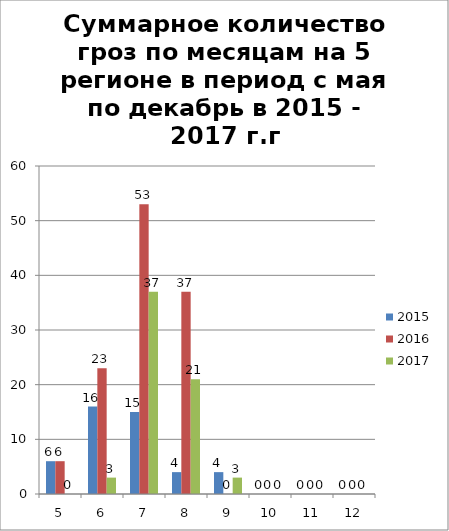
| Category | 2015 | 2016 | 2017 |
|---|---|---|---|
| 5.0 | 6 | 6 | 0 |
| 6.0 | 16 | 23 | 3 |
| 7.0 | 15 | 53 | 37 |
| 8.0 | 4 | 37 | 21 |
| 9.0 | 4 | 0 | 3 |
| 10.0 | 0 | 0 | 0 |
| 11.0 | 0 | 0 | 0 |
| 12.0 | 0 | 0 | 0 |